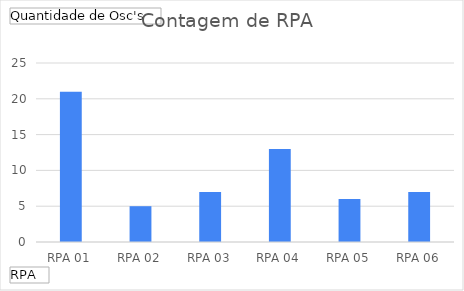
| Category | Total |
|---|---|
| RPA 01 | 21 |
| RPA 02 | 5 |
| RPA 03 | 7 |
| RPA 04 | 13 |
| RPA 05 | 6 |
| RPA 06 | 7 |